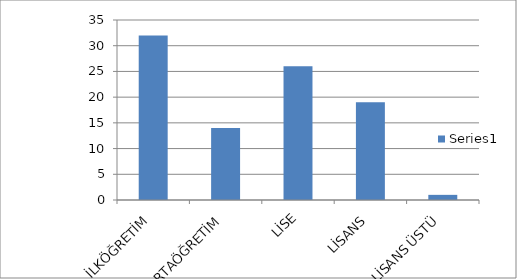
| Category | Series 0 |
|---|---|
| İLKÖĞRETİM | 32 |
| ORTAÖĞRETİM | 14 |
| LİSE | 26 |
| LİSANS | 19 |
| LİSANS ÜSTÜ | 1 |